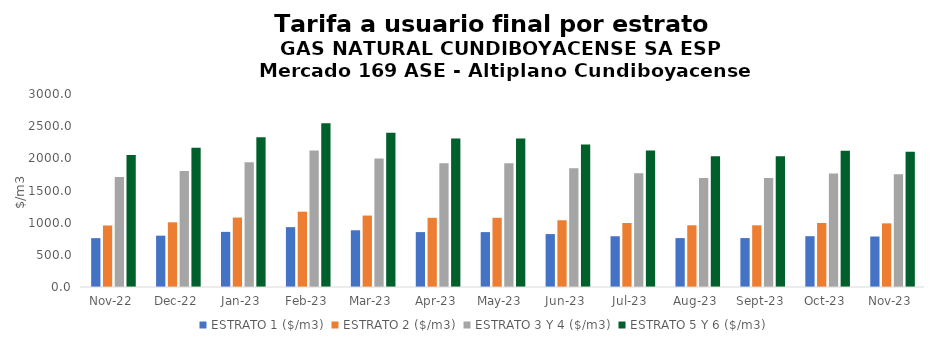
| Category | ESTRATO 1 ($/m3) | ESTRATO 2 ($/m3) | ESTRATO 3 Y 4 ($/m3) | ESTRATO 5 Y 6 ($/m3) |
|---|---|---|---|---|
| 2022-11-01 | 759.45 | 956.41 | 1709.23 | 2051.076 |
| 2022-12-01 | 797.7 | 1005.41 | 1803.47 | 2164.164 |
| 2023-01-01 | 857 | 1079.63 | 1940.74 | 2328.888 |
| 2023-02-01 | 930.14 | 1170.78 | 2119.87 | 2543.844 |
| 2023-03-01 | 882 | 1110.47 | 1998.36 | 2398.032 |
| 2023-04-01 | 853.19 | 1075.46 | 1923.35 | 2308.02 |
| 2023-05-01 | 853.19 | 1075.46 | 1923.35 | 2308.02 |
| 2023-06-01 | 822.7 | 1037.61 | 1845.24 | 2214.288 |
| 2023-07-01 | 788.93 | 994.99 | 1769.1 | 2122.92 |
| 2023-08-01 | 760.33 | 959.38 | 1694.56 | 2033.472 |
| 2023-09-01 | 760.57 | 958.84 | 1694.55 | 2033.46 |
| 2023-10-01 | 789.68 | 995.66 | 1764.51 | 2117.412 |
| 2023-11-01 | 784.66 | 989.45 | 1750.95 | 2101.14 |